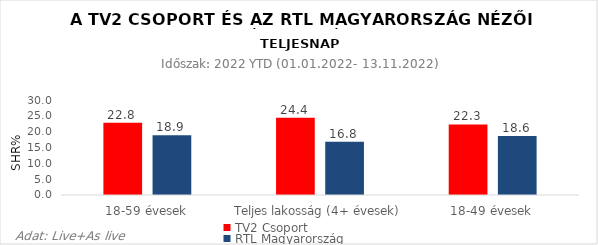
| Category | TV2 Csoport | RTL Magyarország |
|---|---|---|
| 18-59 évesek | 22.8 | 18.9 |
| Teljes lakosság (4+ évesek) | 24.4 | 16.8 |
| 18-49 évesek | 22.3 | 18.6 |